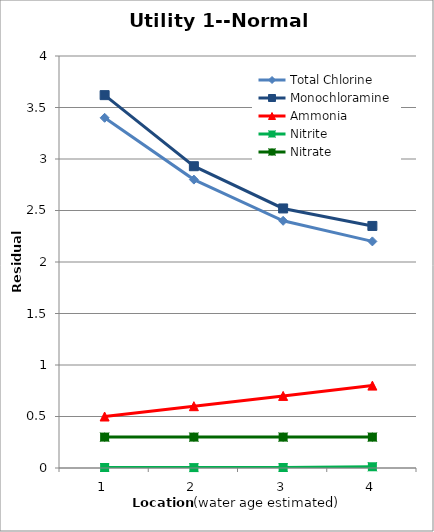
| Category | Total Chlorine | Monochloramine | Ammonia | Nitrite | Nitrate |
|---|---|---|---|---|---|
| 0 | 3.4 | 3.62 | 0.5 | 0.005 | 0.3 |
| 1 | 2.8 | 2.93 | 0.6 | 0.004 | 0.3 |
| 2 | 2.4 | 2.52 | 0.7 | 0.005 | 0.3 |
| 3 | 2.2 | 2.35 | 0.8 | 0.012 | 0.3 |